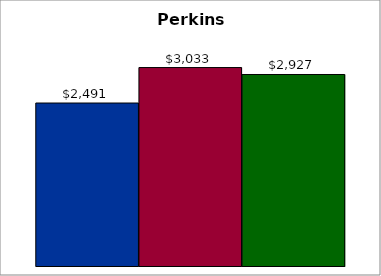
| Category | 50 states and D.C. | SREB states | State |
|---|---|---|---|
| 0 | 2490.943 | 3032.956 | 2926.858 |